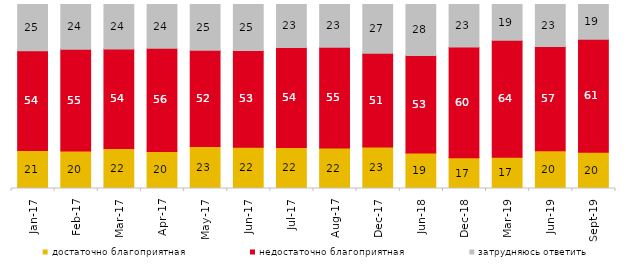
| Category | достаточно благоприятная | недостаточно благоприятная | затрудняюсь ответить |
|---|---|---|---|
| 2017-01-01 | 20.7 | 54.15 | 25.15 |
| 2017-02-01 | 20.4 | 55.3 | 24.3 |
| 2017-03-01 | 21.8 | 54 | 24.2 |
| 2017-04-01 | 20.15 | 56 | 23.75 |
| 2017-05-01 | 22.8 | 52.35 | 24.85 |
| 2017-06-01 | 22.4 | 52.6 | 25 |
| 2017-07-01 | 22.3 | 54.3 | 23.35 |
| 2017-08-01 | 22.05 | 54.65 | 23.3 |
| 2017-12-01 | 22.5 | 51 | 26.5 |
| 2018-06-01 | 19.3 | 53.05 | 27.65 |
| 2018-12-01 | 16.75 | 60.2 | 23.05 |
| 2019-03-01 | 16.957 | 63.55 | 19.493 |
| 2019-06-01 | 20.449 | 56.758 | 22.793 |
| 2019-09-01 | 19.752 | 61.386 | 18.861 |